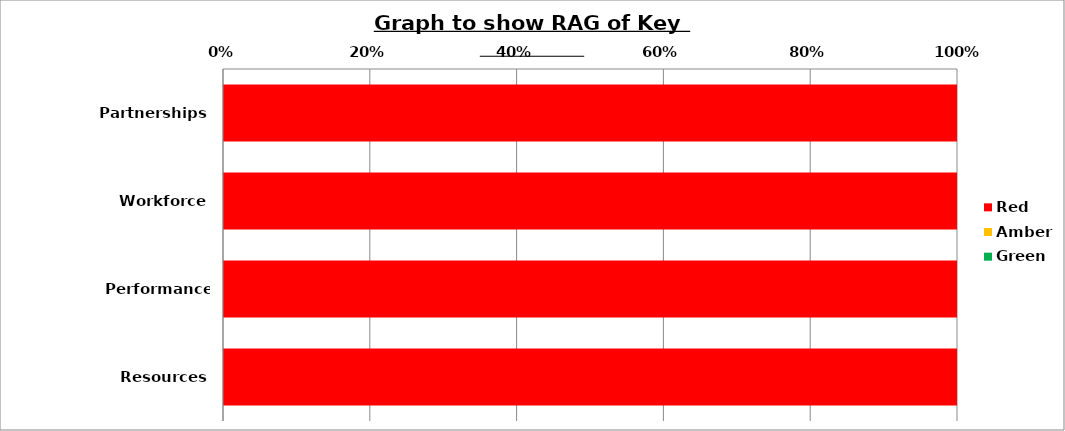
| Category | Red | Amber | Green |
|---|---|---|---|
| Partnerships | 100 | 0 | 0 |
| Workforce | 100 | 0 | 0 |
| Performance Management | 100 | 0 | 0 |
| Resources | 100 | 0 | 0 |